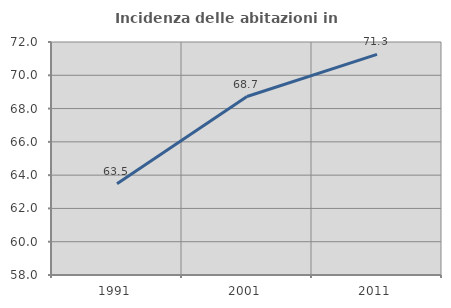
| Category | Incidenza delle abitazioni in proprietà  |
|---|---|
| 1991.0 | 63.487 |
| 2001.0 | 68.724 |
| 2011.0 | 71.255 |